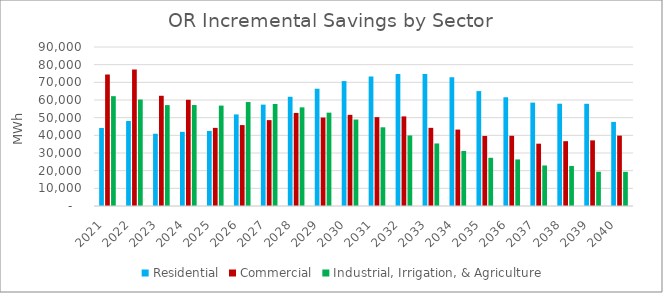
| Category |  Residential  |  Commercial  |  Industrial, Irrigation, & Agriculture  |
|---|---|---|---|
|  2021  | 44184.102 | 74365.269 | 62172.875 |
|  2022  | 48107.052 | 77311.294 | 60265.698 |
|  2023  | 40902.519 | 62396.321 | 57109.682 |
|  2024  | 41973.159 | 60125.994 | 57149.532 |
|  2025  | 42486.837 | 44227.158 | 56830.57 |
|  2026  | 51827.941 | 45797.595 | 58850.377 |
|  2027  | 57378.397 | 48612.538 | 57727.96 |
|  2028  | 61827.267 | 52689.354 | 55835.881 |
|  2029  | 66385.297 | 50076.024 | 52837.816 |
|  2030  | 70719.6 | 51593.263 | 48953.238 |
|  2031  | 73321.519 | 50299.942 | 44540.265 |
|  2032  | 74653.379 | 50715.042 | 39934.051 |
|  2033  | 74676.739 | 44248.55 | 35406.562 |
|  2034  | 72905.173 | 43258.955 | 31151.129 |
|  2035  | 65041.541 | 39647.465 | 27285.532 |
|  2036  | 61549.202 | 39735.725 | 26367.361 |
|  2037  | 58523.942 | 35273.068 | 22941.503 |
|  2038  | 57901.581 | 36695.646 | 22673.689 |
|  2039  | 57855.765 | 37150.974 | 19375.316 |
|  2040  | 47591.905 | 39827.873 | 19337.029 |